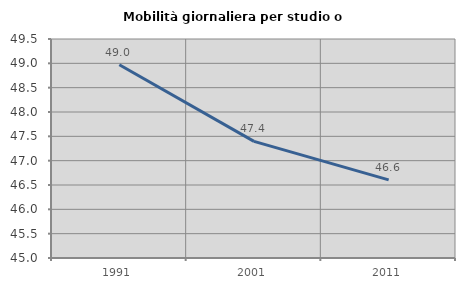
| Category | Mobilità giornaliera per studio o lavoro |
|---|---|
| 1991.0 | 48.971 |
| 2001.0 | 47.396 |
| 2011.0 | 46.605 |